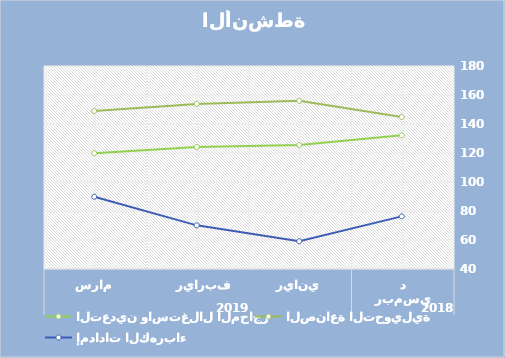
| Category | التعدين واستغلال المحاجر | الصناعة التحويلية | إمدادات الكهرباء |
|---|---|---|---|
| 0 | 132.18 | 144.85 | 76.31 |
| 1 | 125.45 | 155.98 | 59.15 |
| 2 | 124.14 | 153.87 | 70.1 |
| 3 | 119.87 | 148.98 | 89.82 |